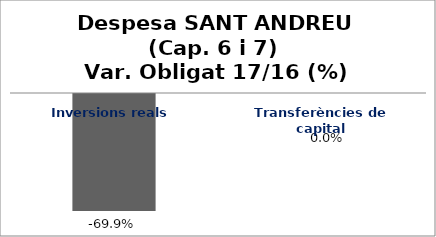
| Category | Series 0 |
|---|---|
| Inversions reals | -0.699 |
| Transferències de capital | 0 |